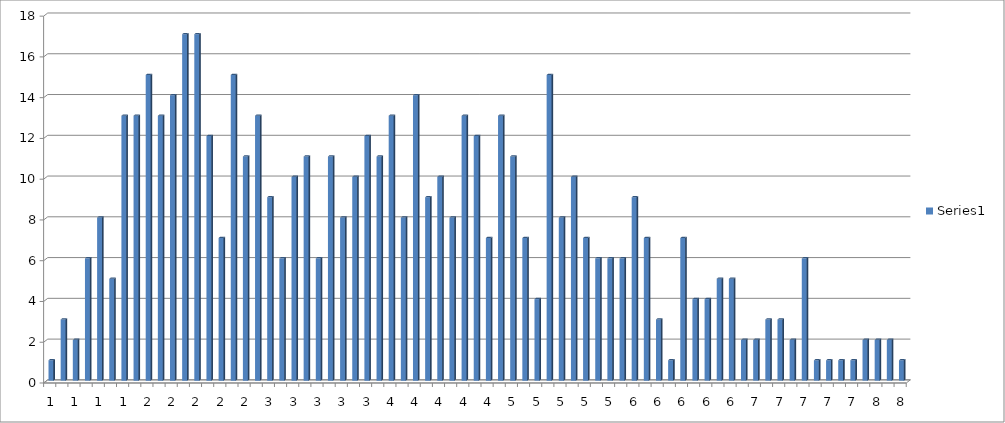
| Category | Series 0 |
|---|---|
| 13.0 | 1 |
| 14.0 | 3 |
| 15.0 | 2 |
| 16.0 | 6 |
| 17.0 | 8 |
| 18.0 | 5 |
| 19.0 | 13 |
| 20.0 | 13 |
| 21.0 | 15 |
| 22.0 | 13 |
| 23.0 | 14 |
| 24.0 | 17 |
| 25.0 | 17 |
| 26.0 | 12 |
| 27.0 | 7 |
| 28.0 | 15 |
| 29.0 | 11 |
| 30.0 | 13 |
| 31.0 | 9 |
| 32.0 | 6 |
| 33.0 | 10 |
| 34.0 | 11 |
| 35.0 | 6 |
| 36.0 | 11 |
| 37.0 | 8 |
| 38.0 | 10 |
| 39.0 | 12 |
| 40.0 | 11 |
| 41.0 | 13 |
| 42.0 | 8 |
| 43.0 | 14 |
| 44.0 | 9 |
| 45.0 | 10 |
| 46.0 | 8 |
| 47.0 | 13 |
| 48.0 | 12 |
| 49.0 | 7 |
| 50.0 | 13 |
| 51.0 | 11 |
| 52.0 | 7 |
| 53.0 | 4 |
| 54.0 | 15 |
| 55.0 | 8 |
| 56.0 | 10 |
| 57.0 | 7 |
| 58.0 | 6 |
| 59.0 | 6 |
| 60.0 | 6 |
| 61.0 | 9 |
| 62.0 | 7 |
| 63.0 | 3 |
| 64.0 | 1 |
| 65.0 | 7 |
| 66.0 | 4 |
| 67.0 | 4 |
| 68.0 | 5 |
| 69.0 | 5 |
| 70.0 | 2 |
| 71.0 | 2 |
| 72.0 | 3 |
| 73.0 | 3 |
| 74.0 | 2 |
| 75.0 | 6 |
| 76.0 | 1 |
| 77.0 | 1 |
| 78.0 | 1 |
| 79.0 | 1 |
| 80.0 | 2 |
| 81.0 | 2 |
| 82.0 | 2 |
| 87.0 | 1 |